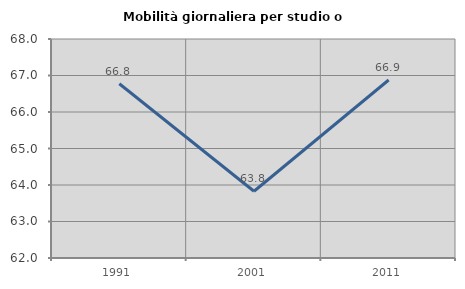
| Category | Mobilità giornaliera per studio o lavoro |
|---|---|
| 1991.0 | 66.773 |
| 2001.0 | 63.829 |
| 2011.0 | 66.876 |